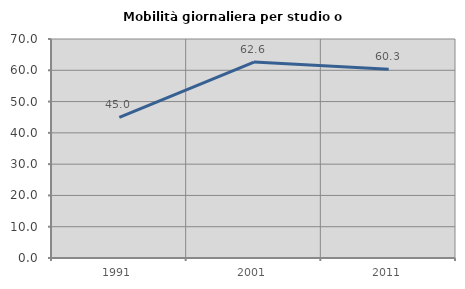
| Category | Mobilità giornaliera per studio o lavoro |
|---|---|
| 1991.0 | 44.978 |
| 2001.0 | 62.621 |
| 2011.0 | 60.294 |